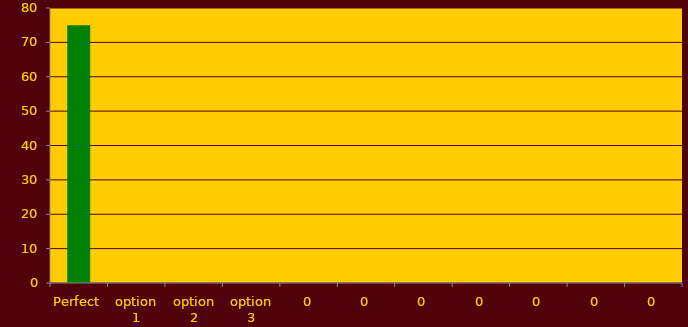
| Category | Series 0 |
|---|---|
| Perfect | 75 |
| option 1 | 0 |
| option 2 | 0 |
| option 3 | 0 |
| 0 | 0 |
| 0 | 0 |
| 0 | 0 |
| 0 | 0 |
| 0 | 0 |
| 0 | 0 |
| 0 | 0 |